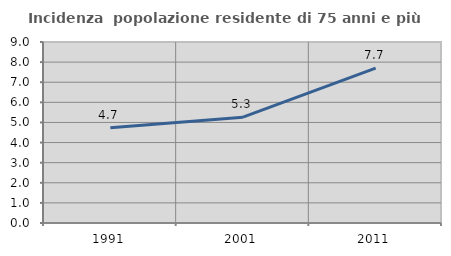
| Category | Incidenza  popolazione residente di 75 anni e più |
|---|---|
| 1991.0 | 4.742 |
| 2001.0 | 5.263 |
| 2011.0 | 7.701 |